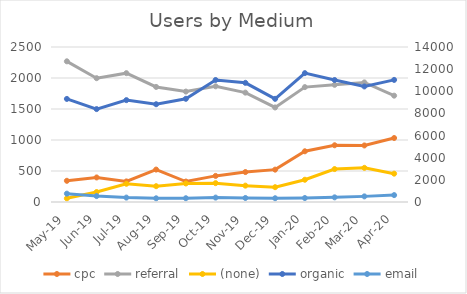
| Category | cpc | referral | (none) |
|---|---|---|---|
| May-19 | 342 | 2269 | 59 |
| Jun-19 | 396 | 1997 | 161 |
| Jul-19 | 332 | 2078 | 294 |
| Aug-19 | 523 | 1856 | 255 |
| Sep-19 | 330 | 1781 | 299 |
| Oct-19 | 421 | 1866 | 304 |
| Nov-19 | 483 | 1764 | 264 |
| Dec-19 | 522 | 1525 | 239 |
| Jan-20 | 818 | 1853 | 359 |
| Feb-20 | 915 | 1890 | 531 |
| Mar-20 | 912 | 1929 | 551 |
| Apr-20 | 1032 | 1715 | 457 |